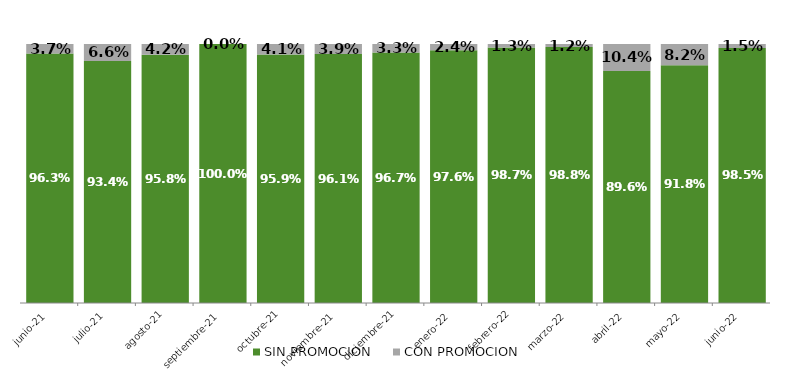
| Category | SIN PROMOCION   | CON PROMOCION   |
|---|---|---|
| 2021-06-01 | 0.963 | 0.037 |
| 2021-07-01 | 0.934 | 0.066 |
| 2021-08-01 | 0.958 | 0.042 |
| 2021-09-01 | 1 | 0 |
| 2021-10-01 | 0.959 | 0.041 |
| 2021-11-01 | 0.961 | 0.039 |
| 2021-12-01 | 0.967 | 0.033 |
| 2022-01-01 | 0.976 | 0.024 |
| 2022-02-01 | 0.987 | 0.013 |
| 2022-03-01 | 0.988 | 0.012 |
| 2022-04-01 | 0.896 | 0.104 |
| 2022-05-01 | 0.918 | 0.082 |
| 2022-06-01 | 0.985 | 0.015 |